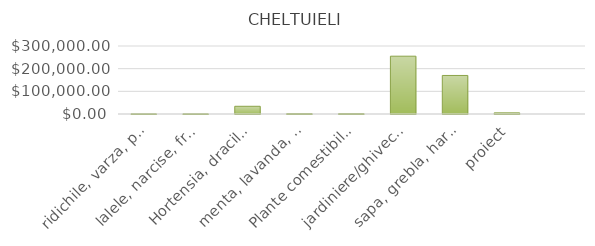
| Category | ridichile, varza, patrunjel, capsuni, morcovi  |
|---|---|
| ridichile, varza, patrunjel, capsuni, morcovi  | 850 |
| lalele, narcise, frezii, bujori | 850 |
| Hortensia, dracila japoneza,forsythia lynwood gold | 34000 |
| menta, lavanda, salvie, rozmarin | 1700 |
| Plante comestibile si plante decorative | 1700 |
| jardiniere/ghivece, pamant si ingrasamant, rasaduri de plante sau semnite, gard de protectiv,arac,plantatorul, etichete | 255000 |
| sapa, grebla, harlet, foarfeca de taiat, manusi, stropitoare, furtun, spaliga  | 170000 |
| proiect | 5000 |